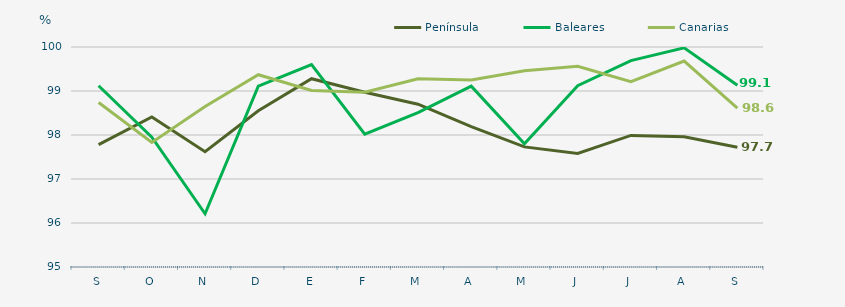
| Category | Península | Baleares | Canarias |
|---|---|---|---|
| S | 97.78 | 99.12 | 98.74 |
| O | 98.41 | 97.95 | 97.83 |
| N | 97.62 | 96.21 | 98.65 |
| D | 98.55 | 99.11 | 99.37 |
| E | 99.28 | 99.6 | 99.01 |
| F | 98.97 | 98.02 | 98.97 |
| M | 98.7 | 98.51 | 99.28 |
| A | 98.19 | 99.11 | 99.25 |
| M | 97.73 | 97.8 | 99.46 |
| J | 97.58 | 99.12 | 99.56 |
| J | 97.99 | 99.69 | 99.21 |
| A | 97.96 | 99.98 | 99.68 |
| S | 97.72 | 99.13 | 98.61 |